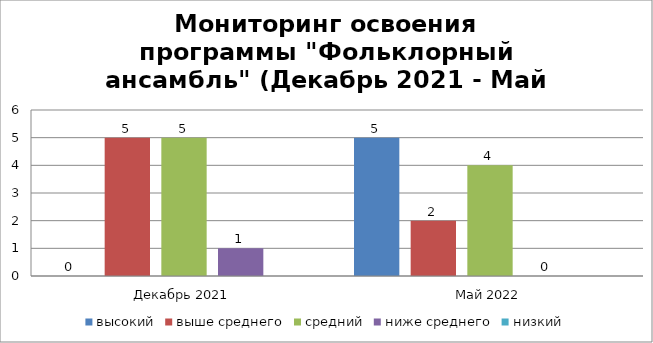
| Category | высокий | выше среднего | средний | ниже среднего | низкий |
|---|---|---|---|---|---|
| Декабрь 2021 | 0 | 5 | 5 | 1 | 0 |
| Май 2022 | 5 | 2 | 4 | 0 | 0 |